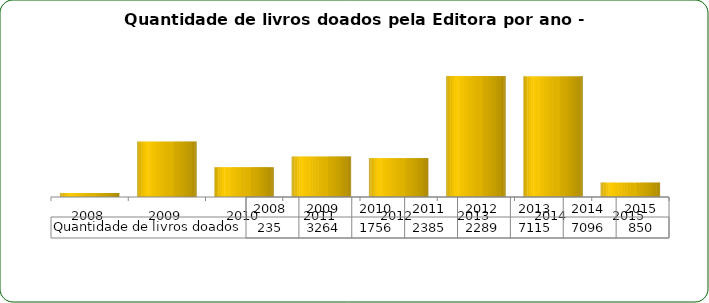
| Category | Quantidade de livros doados |
|---|---|
| 2008.0 | 235 |
| 2009.0 | 3264 |
| 2010.0 | 1756 |
| 2011.0 | 2385 |
| 2012.0 | 2289 |
| 2013.0 | 7115 |
| 2014.0 | 7096 |
| 2015.0 | 850 |